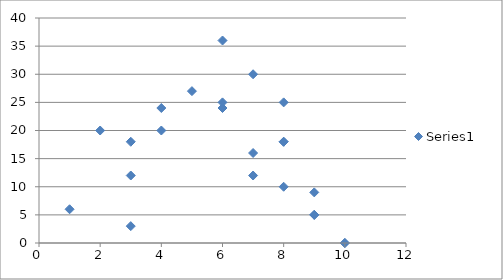
| Category | Series 0 |
|---|---|
| 3.0 | 12 |
| 2.0 | 20 |
| 6.0 | 36 |
| 8.0 | 18 |
| 5.0 | 27 |
| 9.0 | 5 |
| 6.0 | 24 |
| 8.0 | 18 |
| 3.0 | 18 |
| 4.0 | 20 |
| 9.0 | 9 |
| 3.0 | 3 |
| 7.0 | 30 |
| 10.0 | 0 |
| 9.0 | 5 |
| 6.0 | 25 |
| 8.0 | 25 |
| 1.0 | 6 |
| 10.0 | 0 |
| 8.0 | 10 |
| 7.0 | 12 |
| 4.0 | 24 |
| 7.0 | 16 |